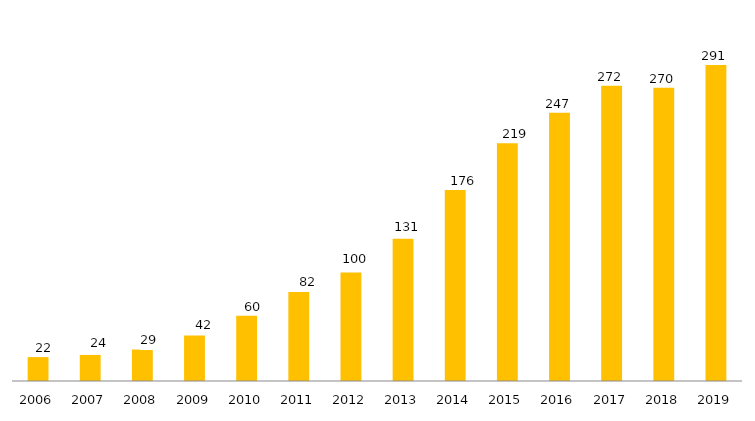
| Category | Programa |
|---|---|
| 2006.0 | 22 |
| 2007.0 | 24 |
| 2008.0 | 29 |
| 2009.0 | 42 |
| 2010.0 | 60 |
| 2011.0 | 82 |
| 2012.0 | 100 |
| 2013.0 | 131 |
| 2014.0 | 176 |
| 2015.0 | 219 |
| 2016.0 | 247 |
| 2017.0 | 272 |
| 2018.0 | 270 |
| 2019.0 | 291 |